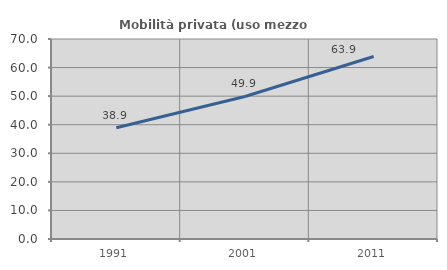
| Category | Mobilità privata (uso mezzo privato) |
|---|---|
| 1991.0 | 38.921 |
| 2001.0 | 49.882 |
| 2011.0 | 63.855 |